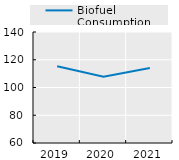
| Category | Biofuel Consumption |
|---|---|
| 2019.0 | 115.328 |
| 2020.0 | 107.713 |
| 2021.0 | 114.037 |